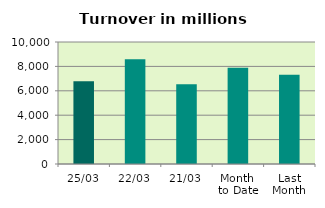
| Category | Series 0 |
|---|---|
| 25/03 | 6779.271 |
| 22/03 | 8579.077 |
| 21/03 | 6533.093 |
| Month 
to Date | 7880.879 |
| Last
Month | 7315.261 |